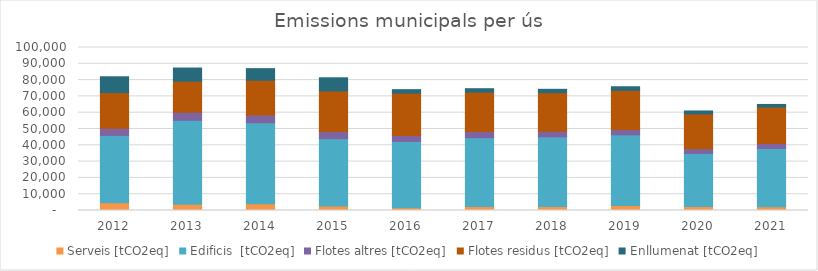
| Category | Serveis [tCO2eq] | Edificis  [tCO2eq] | Flotes altres [tCO2eq] | Flotes residus [tCO2eq] | Enllumenat [tCO2eq] |
|---|---|---|---|---|---|
| 2012.0 | 4789.35 | 41280.7 | 4378.96 | 21884.73 | 9708.46 |
| 2013.0 | 3818.69 | 51476.06 | 4922.23 | 19119.16 | 8067.94 |
| 2014.0 | 4088.18 | 49779.62 | 4681.91 | 21362.86 | 7112.62 |
| 2015.0 | 2744.88 | 41351.23 | 4308.31 | 24923.29 | 8086.13 |
| 2016.0 | 1699.65 | 40683.15 | 3608.87 | 26018.65 | 2126.83 |
| 2017.0 | 2378.57 | 42310.95 | 3733.63 | 24184.05 | 2118.33 |
| 2018.0 | 2399.52 | 42789.69 | 3483.04 | 23622.79 | 2053.03 |
| 2019.0 | 3087.44 | 43322.91 | 3333.4 | 23967.17 | 2214.74 |
| 2020.0 | 2404.71 | 32621.86 | 2931.52 | 21292.63 | 1816.29 |
| 2021.0 | 2275.5 | 35788.95 | 3002 | 22354.72 | 1645.52 |